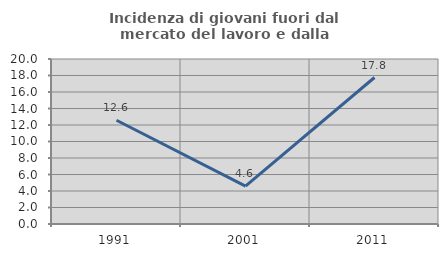
| Category | Incidenza di giovani fuori dal mercato del lavoro e dalla formazione  |
|---|---|
| 1991.0 | 12.575 |
| 2001.0 | 4.587 |
| 2011.0 | 17.757 |